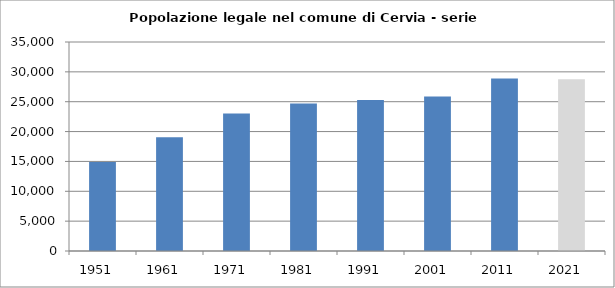
| Category | Popolazione residente |
|---|---|
| 1951   | 14923 |
| 1961   | 19059 |
| 1971   | 23008 |
| 1981   | 24704 |
| 1991   | 25294 |
| 2001   | 25892 |
| 2011   | 28896 |
| 2021   | 28758 |